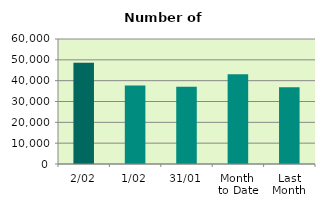
| Category | Series 0 |
|---|---|
| 2/02 | 48548 |
| 1/02 | 37682 |
| 31/01 | 37062 |
| Month 
to Date | 43115 |
| Last
Month | 36886.364 |